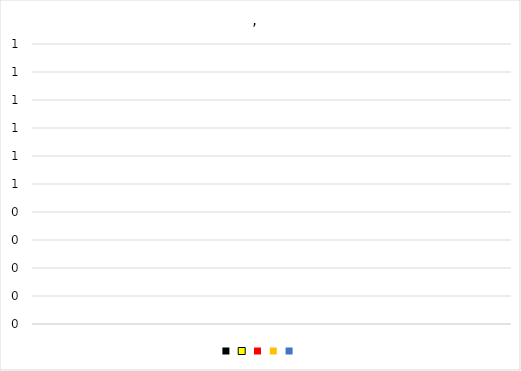
| Category | Series 0 | Series 1 | Series 2 | Series 3 | Series 4 |
|---|---|---|---|---|---|
| 0 | 0 | 0 | 0 | 0 | 0 |